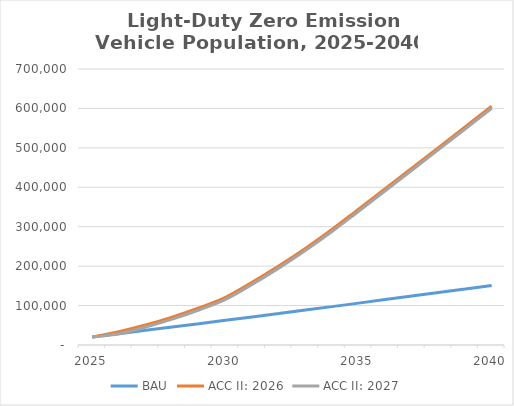
| Category | BAU | ACC II: 2026 | ACC II: 2027 |
|---|---|---|---|
| 2025.0 | 20408.222 | 20408.222 | 20408.222 |
| 2026.0 | 28745.416 | 33980.399 | 28745.416 |
| 2027.0 | 37129.127 | 50747.82 | 45512.837 |
| 2028.0 | 45559.16 | 70744.643 | 65509.66 |
| 2029.0 | 54035.321 | 94004.807 | 88769.824 |
| 2030.0 | 62557.418 | 120958.414 | 115723.432 |
| 2031.0 | 71148.127 | 158917.361 | 153682.378 |
| 2032.0 | 79808.202 | 200203.764 | 194968.781 |
| 2033.0 | 88538.395 | 244869.871 | 239634.888 |
| 2034.0 | 97339.461 | 292968.72 | 287733.737 |
| 2035.0 | 106212.153 | 344554.135 | 339319.153 |
| 2036.0 | 115121.943 | 396355.242 | 391120.26 |
| 2037.0 | 124068.832 | 448372.041 | 443137.058 |
| 2038.0 | 133052.821 | 500604.53 | 495369.547 |
| 2039.0 | 142073.908 | 553052.711 | 547817.728 |
| 2040.0 | 151132.094 | 605716.583 | 600481.6 |